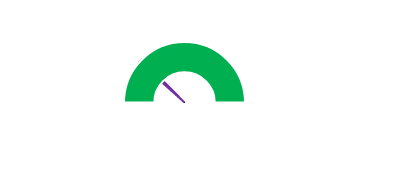
| Category | Pointer |
|---|---|
| 0 | 23.5 |
| 1 | 2 |
| 2 | 176.5 |